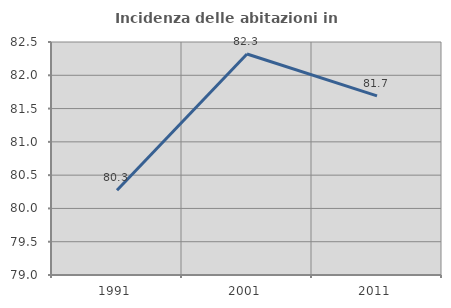
| Category | Incidenza delle abitazioni in proprietà  |
|---|---|
| 1991.0 | 80.273 |
| 2001.0 | 82.319 |
| 2011.0 | 81.69 |